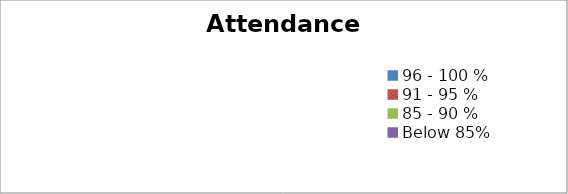
| Category | Series 0 |
|---|---|
| 96 - 100 % | 0 |
| 91 - 95 % | 0 |
| 85 - 90 % | 0 |
| Below 85% | 0 |